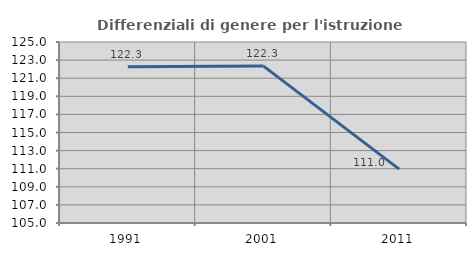
| Category | Differenziali di genere per l'istruzione superiore |
|---|---|
| 1991.0 | 122.269 |
| 2001.0 | 122.34 |
| 2011.0 | 110.956 |